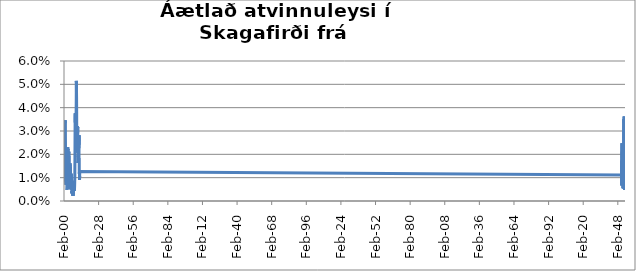
| Category | Series 0 |
|---|---|
| 2000-02-01 | 0.031 |
| 2000-03-01 | 0.03 |
| 2000-04-01 | 0.029 |
| 2000-05-01 | 0.023 |
| 2000-06-01 | 0.018 |
| 2000-07-01 | 0.017 |
| 2000-08-01 | 0.014 |
| 2000-09-01 | 0.009 |
| 2000-10-01 | 0.011 |
| 2000-11-01 | 0.024 |
| 2000-12-01 | 0.029 |
| 2001-01-01 | 0.035 |
| 2001-02-01 | 0.033 |
| 2001-03-01 | 0.028 |
| 2001-04-01 | 0.025 |
| 2001-05-01 | 0.016 |
| 2001-06-01 | 0.01 |
| 2001-07-01 | 0.012 |
| 2001-08-01 | 0.008 |
| 2001-09-01 | 0.007 |
| 2001-10-01 | 0.01 |
| 2001-11-01 | 0.013 |
| 2001-12-01 | 0.017 |
| 2002-01-01 | 0.016 |
| 2002-02-01 | 0.016 |
| 2002-03-01 | 0.018 |
| 2002-04-01 | 0.018 |
| 2002-05-01 | 0.014 |
| 2002-06-01 | 0.009 |
| 2002-07-01 | 0.005 |
| 2002-08-01 | 0.005 |
| 2002-09-01 | 0.006 |
| 2002-10-01 | 0.012 |
| 2002-11-01 | 0.015 |
| 2002-12-01 | 0.018 |
| 2003-01-01 | 0.022 |
| 2003-02-01 | 0.023 |
| 2003-03-01 | 0.022 |
| 2003-04-01 | 0.022 |
| 2003-05-01 | 0.016 |
| 2003-06-01 | 0.008 |
| 2003-07-01 | 0.007 |
| 2003-08-01 | 0.013 |
| 2003-09-01 | 0.014 |
| 2003-10-01 | 0.008 |
| 2003-11-01 | 0.011 |
| 2003-12-01 | 0.013 |
| 2004-01-01 | 0.021 |
| 2004-02-01 | 0.021 |
| 2004-03-01 | 0.02 |
| 2004-04-01 | 0.019 |
| 2004-05-01 | 0.017 |
| 2004-06-01 | 0.013 |
| 2004-07-01 | 0.012 |
| 2004-08-01 | 0.005 |
| 2004-09-01 | 0.006 |
| 2004-10-01 | 0.008 |
| 2004-11-01 | 0.009 |
| 2004-12-01 | 0.013 |
| 2005-01-01 | 0.016 |
| 2005-02-01 | 0.015 |
| 2005-03-01 | 0.012 |
| 2005-04-01 | 0.015 |
| 2005-05-01 | 0.013 |
| 2005-06-01 | 0.01 |
| 2005-07-01 | 0.008 |
| 2005-08-01 | 0.006 |
| 2005-09-01 | 0.005 |
| 2005-10-01 | 0.008 |
| 2005-11-01 | 0.012 |
| 2005-12-01 | 0.01 |
| 2006-01-01 | 0.011 |
| 2006-02-01 | 0.011 |
| 2006-03-01 | 0.01 |
| 2006-04-01 | 0.009 |
| 2006-05-01 | 0.006 |
| 2006-06-01 | 0.003 |
| 2006-07-01 | 0.004 |
| 2006-08-01 | 0.003 |
| 2006-09-01 | 0.003 |
| 2006-10-01 | 0.004 |
| 2006-11-01 | 0.004 |
| 2006-12-01 | 0.004 |
| 2007-01-01 | 0.004 |
| 2007-02-01 | 0.006 |
| 2007-03-01 | 0.004 |
| 2007-04-01 | 0.003 |
| 2007-05-01 | 0.006 |
| 2007-06-01 | 0.002 |
| 2007-07-01 | 0.004 |
| 2007-08-01 | 0.004 |
| 2007-09-01 | 0.005 |
| 2007-10-01 | 0.004 |
| 2007-11-01 | 0.006 |
| 2007-12-01 | 0.006 |
| 2008-01-01 | 0.008 |
| 2008-02-01 | 0.009 |
| 2008-03-01 | 0.008 |
| 2008-04-01 | 0.007 |
| 2008-05-01 | 0.007 |
| 2008-06-01 | 0.006 |
| 2008-07-01 | 0.004 |
| 2008-08-01 | 0.005 |
| 2008-09-01 | 0.006 |
| 2008-10-01 | 0.008 |
| 2008-11-01 | 0.011 |
| 2008-12-01 | 0.017 |
| 2009-01-01 | 0.026 |
| 2009-02-01 | 0.036 |
| 2009-03-01 | 0.037 |
| 2009-04-01 | 0.038 |
| 2009-05-01 | 0.029 |
| 2009-06-01 | 0.026 |
| 2009-07-01 | 0.024 |
| 2009-08-01 | 0.022 |
| 2009-09-01 | 0.021 |
| 2009-10-01 | 0.031 |
| 2009-11-01 | 0.036 |
| 2009-12-01 | 0.039 |
| 2010-01-01 | 0.044 |
| 2010-02-01 | 0.051 |
| 2010-03-01 | 0.048 |
| 2010-04-01 | 0.045 |
| 2010-05-01 | 0.038 |
| 2010-06-01 | 0.024 |
| 2010-07-01 | 0.024 |
| 2010-08-01 | 0.024 |
| 2010-09-01 | 0.026 |
| 2010-10-01 | 0.027 |
| 2010-11-01 | 0.031 |
| 2010-12-01 | 0.03 |
| 2011-01-01 | 0.032 |
| 2011-02-01 | 0.031 |
| 2011-03-01 | 0.032 |
| 2011-04-01 | 0.029 |
| 2011-05-01 | 0.022 |
| 2011-06-01 | 0.021 |
| 2011-07-01 | 0.016 |
| 2011-08-01 | 0.019 |
| 2011-09-01 | 0.019 |
| 2011-10-01 | 0.02 |
| 2011-11-01 | 0.023 |
| 2011-12-01 | 0.026 |
| 2012-01-01 | 0.024 |
| 2012-02-01 | 0.024 |
| 2012-03-01 | 0.028 |
| 2012-04-01 | 0.023 |
| 2012-05-01 | 0.018 |
| 2012-06-01 | 0.012 |
| 2012-07-01 | 0.012 |
| 2012-08-01 | 0.013 |
| 2012-09-01 | 0.009 |
| 2012-10-01 | 0.011 |
| 2012-11-01 | 0.013 |
| 2012-12-01 | 0.013 |
| 201301.0 | 0.011 |
| 201302.0 | 0.014 |
| 201303.0 | 0.016 |
| 201304.0 | 0.015 |
| 201305.0 | 0.012 |
| 201306.0 | 0.009 |
| 201307.0 | 0.008 |
| 201308.0 | 0.008 |
| 201309.0 | 0.007 |
| 201310.0 | 0.008 |
| 201311.0 | 0.007 |
| 201312.0 | 0.01 |
| 201401.0 | 0.018 |
| 201402.0 | 0.025 |
| 201403.0 | 0.022 |
| 201404.0 | 0.019 |
| 201405.0 | 0.015 |
| 201406.0 | 0.016 |
| 201407.0 | 0.017 |
| 201408.0 | 0.014 |
| 201409.0 | 0.017 |
| 201410.0 | 0.019 |
| 201411.0 | 0.02 |
| 201412.0 | 0.02 |
| 201501.0 | 0.022 |
| 201502.0 | 0.018 |
| 201503.0 | 0.017 |
| 201504.0 | 0.016 |
| 201505.0 | 0.014 |
| 201506.0 | 0.011 |
| 201507.0 | 0.012 |
| 201508.0 | 0.014 |
| 201509.0 | 0.014 |
| 201510.0 | 0.015 |
| 201511.0 | 0.015 |
| 201512.0 | 0.018 |
| 201601.0 | 0.018 |
| 201602.0 | 0.018 |
| 201603.0 | 0.016 |
| 201604.0 | 0.013 |
| 201605.0 | 0.01 |
| 201606.0 | 0.009 |
| 201607.0 | 0.013 |
| 201608.0 | 0.011 |
| 201609.0 | 0.009 |
| 201610.0 | 0.01 |
| 201611.0 | 0.015 |
| 201612.0 | 0.018 |
| 201701.0 | 0.024 |
| 201702.0 | 0.022 |
| 201703.0 | 0.018 |
| 201704.0 | 0.013 |
| 201705.0 | 0.011 |
| 201706.0 | 0.008 |
| 201707.0 | 0.006 |
| 201708.0 | 0.005 |
| 201709.0 | 0.007 |
| 201710.0 | 0.009 |
| 201711.0 | 0.009 |
| 201712.0 | 0.009 |
| 201801.0 | 0.014 |
| 201802.0 | 0.013 |
| 201803.0 | 0.011 |
| 201804.0 | 0.012 |
| 201805.0 | 0.008 |
| 201806.0 | 0.008 |
| 201807.0 | 0.009 |
| 201808.0 | 0.007 |
| 201809.0 | 0.011 |
| 201810.0 | 0.012 |
| 201811.0 | 0.011 |
| 201812.0 | 0.012 |
| 201901.0 | 0.011 |
| 201902.0 | 0.011 |
| 201903.0 | 0.01 |
| 201904.0 | 0.008 |
| 201905.0 | 0.009 |
| 201906.0 | 0.007 |
| 201907.0 | 0.007 |
| 201908.0 | 0.006 |
| 201909.0 | 0.005 |
| 201910.0 | 0.012 |
| 201911.0 | 0.014 |
| 201912.0 | 0.016 |
| 202001.0 | 0.02 |
| 202002.0 | 0.019 |
| 202003.0 | 0.032 |
| 202004.0 | 0.035 |
| 202005.0 | 0.027 |
| 202006.0 | 0.025 |
| 202007.0 | 0.024 |
| 202008.0 | 0.028 |
| 202009.0 | 0.031 |
| 202010.0 | 0.034 |
| 202011.0 | 0.034 |
| 202012.0 | 0.036 |
| 202101.0 | 0.036 |
| 202102.0 | 0.033 |
| 202103.0 | 0.035 |
| 202104.0 | 0.032 |
| 202105.0 | 0.023 |
| 202106.0 | 0.021 |
| 202107.0 | 0.019 |
| 202108.0 | 0.016 |
| 202109.0 | 0.014 |
| 202110.0 | 0.014 |
| 202111.0 | 0.014 |
| 202112.0 | 0.016 |
| 202201.0 | 0.015 |
| 202202.0 | 0.014 |
| 202203.0 | 0.013 |
| 202204.0 | 0.013 |
| 202205.0 | 0.007 |
| 202206.0 | 0.006 |
| 202207.0 | 0.005 |
| 202208.0 | 0.006 |
| 202209.0 | 0.007 |
| 202210.0 | 0.006 |
| 202211.0 | 0.006 |
| 202212.0 | 0.008 |
| 202301.0 | 0.009 |
| 202302.0 | 0.008 |
| 202303.0 | 0.007 |
| 202304.0 | 0.007 |